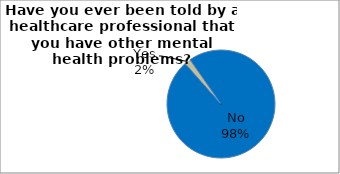
| Category | Series 0 |
|---|---|
| No | 98.177 |
| Yes | 1.823 |